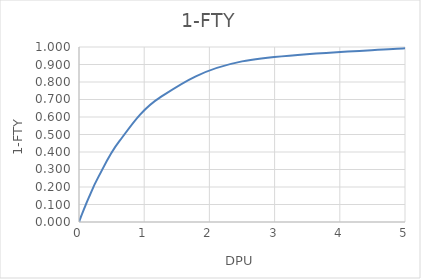
| Category | 1-FTY |
|---|---|
| 5.0 | 0.993 |
| 2.5 | 0.918 |
| 1.25 | 0.713 |
| 0.625 | 0.465 |
| 0.3 | 0.259 |
| 0.15 | 0.139 |
| 0.075 | 0.072 |
| 0.038 | 0.037 |
| 0.019 | 0.019 |
| 0.009 | 0.009 |
| 0.004 | 0.004 |